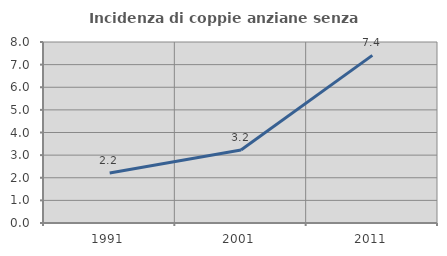
| Category | Incidenza di coppie anziane senza figli  |
|---|---|
| 1991.0 | 2.214 |
| 2001.0 | 3.226 |
| 2011.0 | 7.407 |